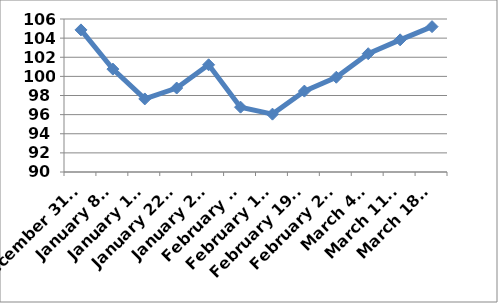
| Category | Series 0 |
|---|---|
| December 31st  | 104.86 |
| January 8th | 100.76 |
| January 15th | 97.64 |
| January 22nd | 98.78 |
| January 29th | 101.21 |
| February 5th | 96.78 |
| February 12th | 96.05 |
| February 19th  | 98.46 |
| February 26th | 99.91 |
| March 4th | 102.37 |
| March 11th | 103.82 |
| March 18th | 105.2 |